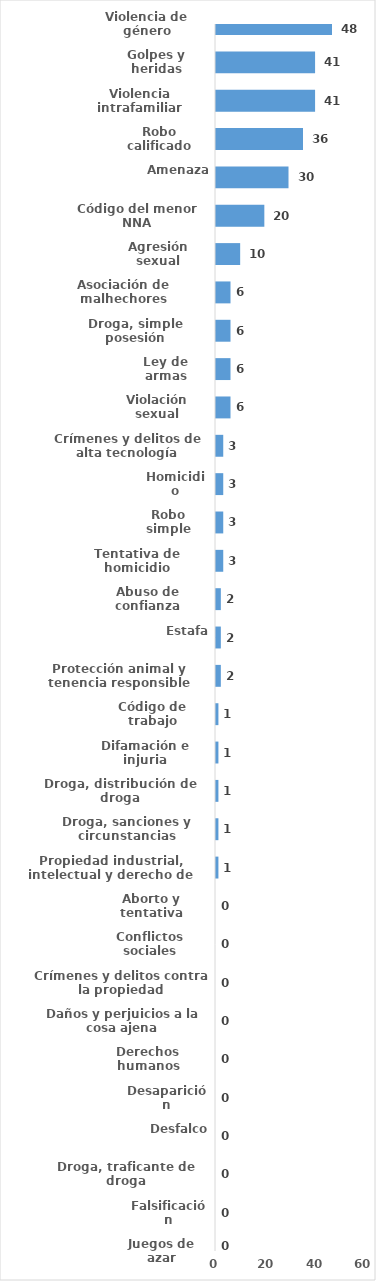
| Category | Series 0 |
|---|---|
| Violencia de género | 48 |
| Golpes y heridas | 41 |
| Violencia intrafamiliar | 41 |
| Robo calificado | 36 |
| Amenaza | 30 |
| Código del menor NNA | 20 |
| Agresión sexual | 10 |
| Asociación de malhechores | 6 |
| Droga, simple posesión | 6 |
| Ley de armas | 6 |
| Violación sexual | 6 |
| Crímenes y delitos de alta tecnología | 3 |
| Homicidio | 3 |
| Robo simple | 3 |
| Tentativa de homicidio | 3 |
| Abuso de confianza | 2 |
| Estafa | 2 |
| Protección animal y tenencia responsible | 2 |
| Código de trabajo | 1 |
| Difamación e injuria | 1 |
| Droga, distribución de droga | 1 |
| Droga, sanciones y circunstancias agravantes | 1 |
| Propiedad industrial, intelectual y derecho de autor | 1 |
| Aborto y tentativa | 0 |
| Conflictos sociales | 0 |
| Crímenes y delitos contra la propiedad | 0 |
| Daños y perjuicios a la cosa ajena | 0 |
| Derechos humanos | 0 |
| Desaparición | 0 |
| Desfalco | 0 |
| Droga, traficante de droga | 0 |
| Falsificación | 0 |
| Juegos de azar | 0 |